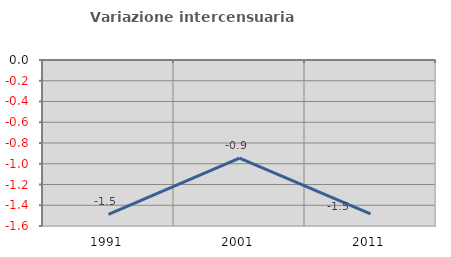
| Category | Variazione intercensuaria annua |
|---|---|
| 1991.0 | -1.489 |
| 2001.0 | -0.945 |
| 2011.0 | -1.483 |